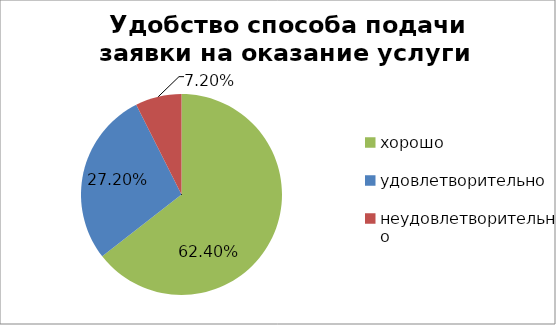
| Category | Series 0 |
|---|---|
| хорошо | 0.624 |
| удовлетворительно | 0.272 |
| неудовлетворительно | 0.072 |